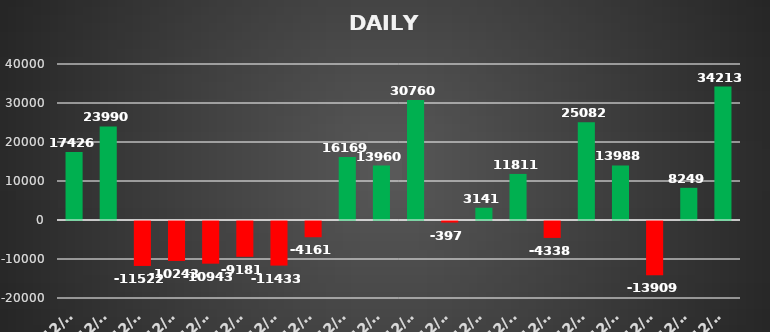
| Category | Series 0 |
|---|---|
| 2021-12-01 | 17426.157 |
| 2021-12-02 | 23990.49 |
| 2021-12-06 | -11521.763 |
| 2021-12-07 | -10243.128 |
| 2021-12-08 | -10943.185 |
| 2021-12-09 | -9181.275 |
| 2021-12-10 | -11433.123 |
| 2021-12-13 | -4161.375 |
| 2021-12-14 | 16168.71 |
| 2021-12-16 | 13960.438 |
| 2021-12-17 | 30759.84 |
| 2021-12-21 | -397.438 |
| 2021-12-22 | 3141.171 |
| 2021-12-23 | 11810.89 |
| 2021-12-24 | -4337.8 |
| 2021-12-27 | 25081.5 |
| 2021-12-28 | 13987.8 |
| 2021-12-29 | -13909.07 |
| 2021-12-30 | 8249.18 |
| 2021-12-31 | 34212.953 |